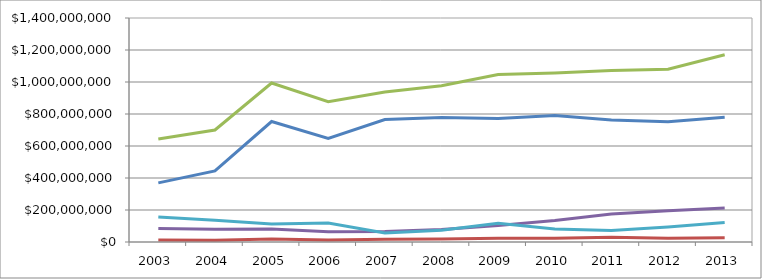
| Category | Donations  | Legacies  | Total revenue  | Australian aid grants  | Other grants  |
|---|---|---|---|---|---|
| 2003 | 369560674.28 | 12093053.257 | 643586645.7 | 84890194.463 | 156008720.224 |
| 2004 | 444692140.516 | 11527794.308 | 699886083.538 | 80399455.28 | 135231951.107 |
| 2005 | 752856001.617 | 18509576.838 | 993824647.777 | 81196009.995 | 112238967.811 |
| 2006 | 647085333.565 | 12127956.256 | 876857181.048 | 63641147.553 | 118186686.338 |
| 2007 | 765443048.123 | 17034905.948 | 938034737.072 | 65173887.161 | 56160204.99 |
| 2008 | 777812527.943 | 18208573.45 | 976685512.541 | 78222820.655 | 73345455.576 |
| 2009 | 772492543.13 | 23331701.567 | 1046523305.154 | 103861876.418 | 116993405.671 |
| 2010 | 790060420.559 | 23689713.808 | 1056420799.445 | 134494880.722 | 80718722.033 |
| 2011 | 762328792.02 | 28998123.488 | 1071574898.198 | 174321325.871 | 71240932.653 |
| 2012 | 752007812.629 | 23856605.554 | 1080256415.127 | 195150735.295 | 93136053.574 |
| 2013 | 780001976 | 27047388 | 1170046563 | 212247937 | 121864039 |